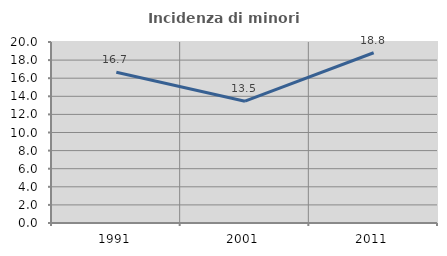
| Category | Incidenza di minori stranieri |
|---|---|
| 1991.0 | 16.667 |
| 2001.0 | 13.462 |
| 2011.0 | 18.812 |